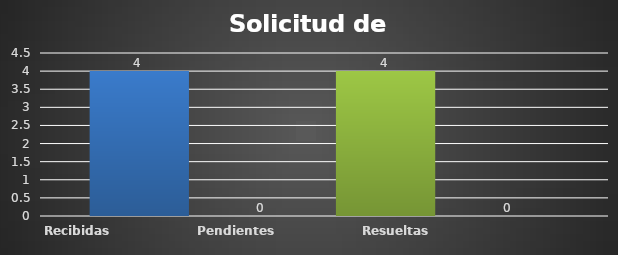
| Category | Recibidas  | Pendientes  | Resueltas | Rechazadas  |
|---|---|---|---|---|
| Recibidas  | 4 | 0 | 4 | 0 |